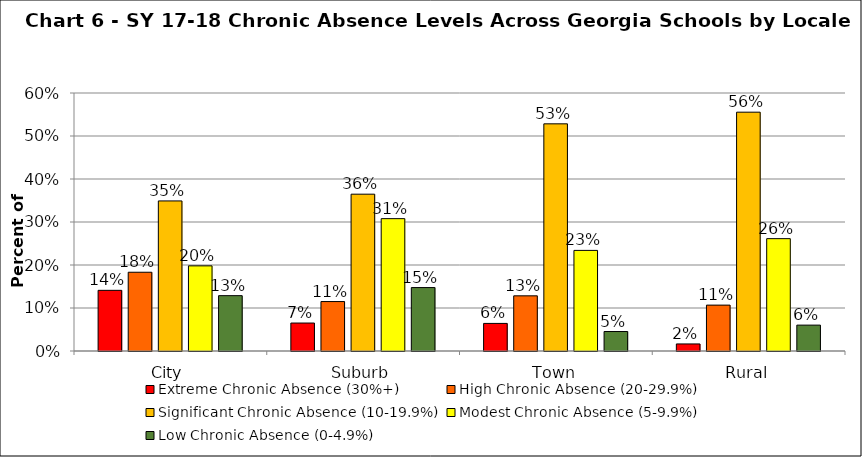
| Category | Extreme Chronic Absence (30%+) | High Chronic Absence (20-29.9%) | Significant Chronic Absence (10-19.9%) | Modest Chronic Absence (5-9.9%) | Low Chronic Absence (0-4.9%) |
|---|---|---|---|---|---|
| 0 | 0.141 | 0.183 | 0.349 | 0.198 | 0.129 |
| 1 | 0.065 | 0.115 | 0.365 | 0.308 | 0.148 |
| 2 | 0.064 | 0.128 | 0.528 | 0.234 | 0.045 |
| 3 | 0.016 | 0.107 | 0.555 | 0.261 | 0.06 |